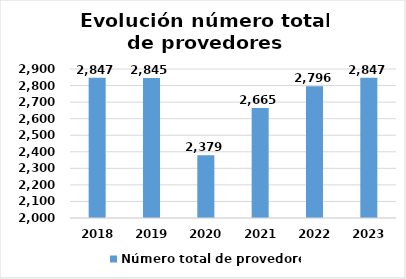
| Category | Número total de provedores |
|---|---|
| 2018.0 | 2847 |
| 2019.0 | 2845 |
| 2020.0 | 2379 |
| 2021.0 | 2665 |
| 2022.0 | 2796 |
| 2023.0 | 2847 |